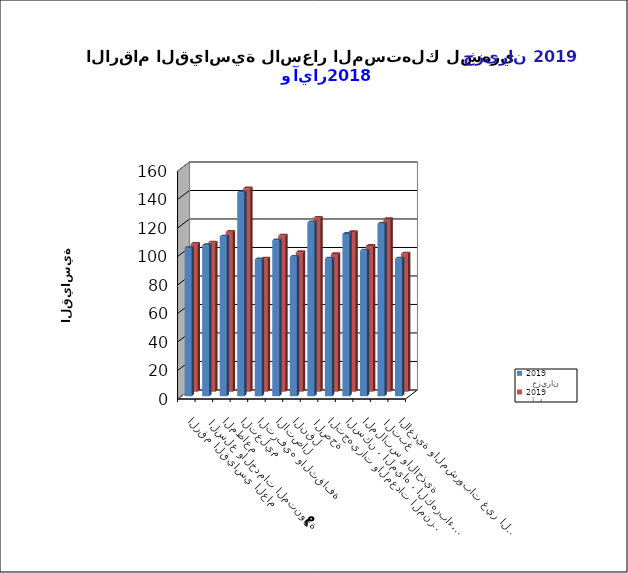
| Category |   حزيران     2019      |   آيار     2019      |
|---|---|---|
| الاغذية والمشروبات غير الكحولية | 96.6 | 96.9 |
|  التبغ | 121.1 | 121.1 |
| الملابس والاحذية | 102.2 | 102.3 |
| السكن ، المياه ، الكهرباء، الغاز  | 113.9 | 112.1 |
| التجهيزات والمعدات المنزلية والصيانة | 96.6 | 96.6 |
|  الصحة | 122 | 122 |
| النقل | 97.8 | 97.9 |
| الاتصال | 109.5 | 109.6 |
| الترفيه والثقافة | 96 | 93.4 |
| التعليم | 143.1 | 142.8 |
| المطاعم  | 112.1 | 112.2 |
|  السلع والخدمات المتنوعة | 106 | 104.7 |
| الرقم القياسي العام | 104.2 | 103.8 |